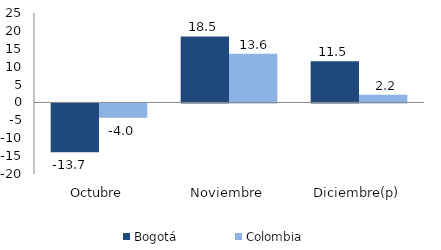
| Category | Bogotá | Colombia |
|---|---|---|
| Octubre | -13.654 | -3.972 |
| Noviembre | 18.455 | 13.628 |
| Diciembre(p) | 11.523 | 2.17 |